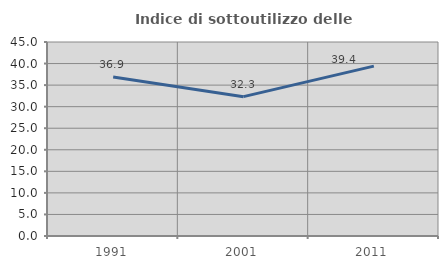
| Category | Indice di sottoutilizzo delle abitazioni  |
|---|---|
| 1991.0 | 36.898 |
| 2001.0 | 32.323 |
| 2011.0 | 39.409 |